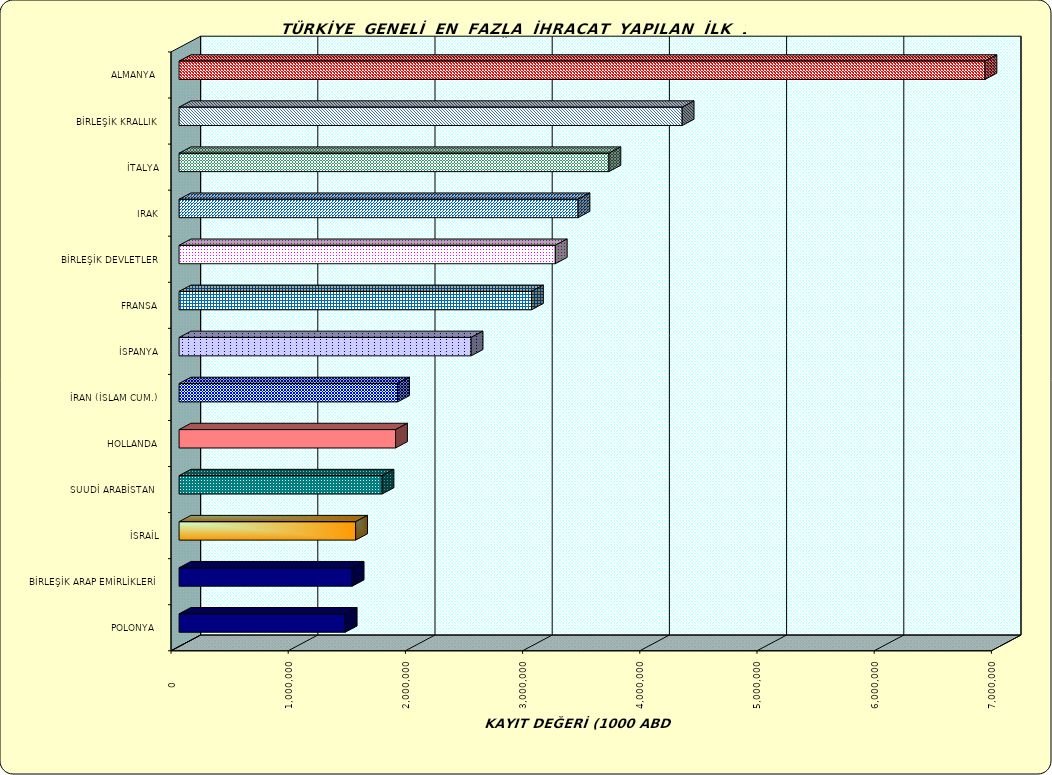
| Category | Series 0 |
|---|---|
| ALMANYA  | 6876295.805 |
| BİRLEŞİK KRALLIK | 4292698.219 |
| İTALYA | 3667892.731 |
| IRAK | 3404131.094 |
| BİRLEŞİK DEVLETLER | 3210103.079 |
| FRANSA | 3007050.614 |
| İSPANYA | 2492083.103 |
| İRAN (İSLAM CUM.) | 1864647.892 |
| HOLLANDA | 1847129.154 |
| SUUDİ ARABİSTAN  | 1731908.824 |
| İSRAİL | 1506299.367 |
| BİRLEŞİK ARAP EMİRLİKLERİ | 1477056.411 |
| POLONYA  | 1417867.494 |